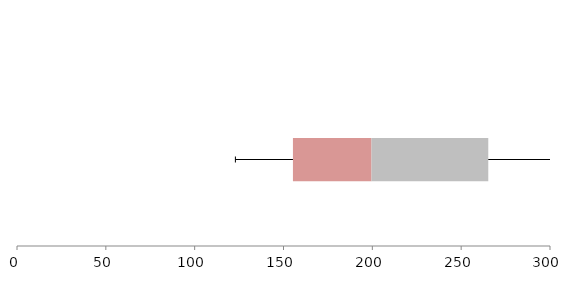
| Category | Series 1 | Series 2 | Series 3 |
|---|---|---|---|
| 0 | 155.312 | 44.218 | 65.726 |